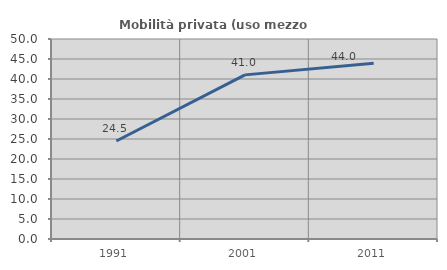
| Category | Mobilità privata (uso mezzo privato) |
|---|---|
| 1991.0 | 24.493 |
| 2001.0 | 41.03 |
| 2011.0 | 43.951 |